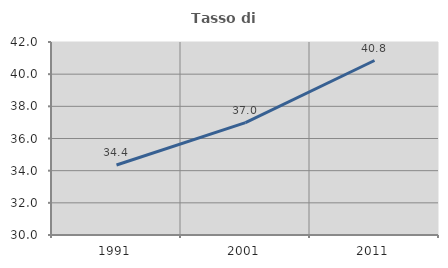
| Category | Tasso di occupazione   |
|---|---|
| 1991.0 | 34.351 |
| 2001.0 | 36.984 |
| 2011.0 | 40.848 |